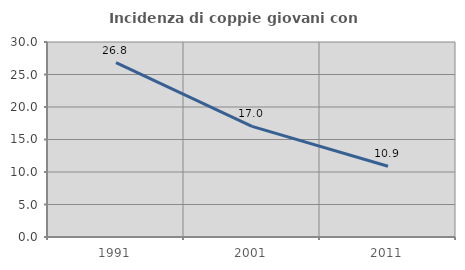
| Category | Incidenza di coppie giovani con figli |
|---|---|
| 1991.0 | 26.813 |
| 2001.0 | 17.014 |
| 2011.0 | 10.878 |